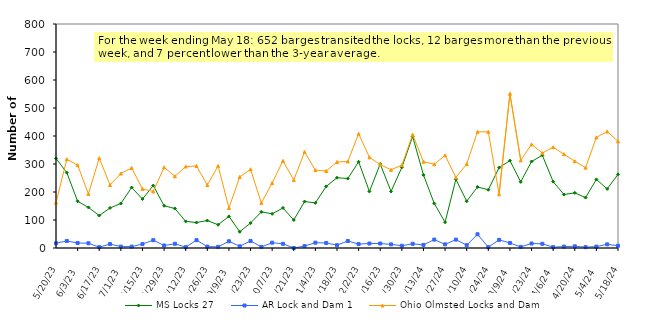
| Category | MS Locks 27 | AR Lock and Dam 1 | Ohio Olmsted Locks and Dam |
|---|---|---|---|
| 5/20/23 | 320 | 17 | 162 |
| 5/27/23 | 269 | 25 | 317 |
| 6/3/23 | 167 | 18 | 296 |
| 6/10/23 | 145 | 17 | 193 |
| 6/17/23 | 116 | 3 | 321 |
| 6/24/23 | 143 | 14 | 225 |
| 7/1/23 | 159 | 5 | 266 |
| 7/8/23 | 216 | 5 | 286 |
| 7/15/23 | 175 | 14 | 211 |
| 7/22/23 | 223 | 28 | 202 |
| 7/29/23 | 151 | 9 | 288 |
| 8/5/23 | 141 | 15 | 256 |
| 8/12/23 | 95 | 3 | 291 |
| 8/19/23 | 91 | 28 | 293 |
| 8/26/23 | 98 | 5 | 225 |
| 9/2/23 | 83 | 4 | 293 |
| 9/9/23 | 113 | 24 | 143 |
| 9/16/23 | 58 | 6 | 254 |
| 9/23/23 | 89 | 25 | 281 |
| 9/30/23 | 129 | 4 | 161 |
| 10/7/23 | 122 | 19 | 232 |
| 10/14/23 | 143 | 15 | 311 |
| 10/21/23 | 100 | 0 | 243 |
| 10/28/23 | 166 | 7 | 343 |
| 11/4/23 | 161 | 19 | 278 |
| 11/11/23 | 220 | 18 | 275 |
| 11/18/23 | 251 | 10 | 307 |
| 11/25/23 | 248 | 25 | 309 |
| 12/2/23 | 308 | 14 | 408 |
| 12/9/23 | 202 | 16 | 324 |
| 12/16/23 | 300 | 16 | 298 |
| 12/23/23 | 202 | 13 | 279 |
| 12/30/23 | 288 | 8 | 296 |
| 1/6/24 | 398 | 15 | 405 |
| 1/13/24 | 261 | 11 | 308 |
| 1/20/24 | 159 | 30 | 299 |
| 1/27/24 | 92 | 13 | 331 |
| 2/3/24 | 245 | 30 | 252 |
| 2/10/24 | 167 | 10 | 300 |
| 2/17/24 | 218 | 49 | 415 |
| 2/24/24 | 208 | 3 | 415 |
| 3/2/24 | 287 | 29 | 192 |
| 3/9/24 | 312 | 18 | 551 |
| 3/16/24 | 236 | 4 | 313 |
| 3/23/24 | 309 | 16 | 370 |
| 3/30/24 | 331 | 15 | 339 |
| 4/6/24 | 237 | 3 | 360 |
| 4/13/24 | 191 | 5 | 335 |
| 4/20/24 | 197 | 6 | 310 |
| 4/27/24 | 180 | 3 | 287 |
| 5/4/24 | 245 | 5 | 395 |
| 5/11/24 | 211 | 13 | 416 |
| 5/18/24 | 263 | 8 | 381 |